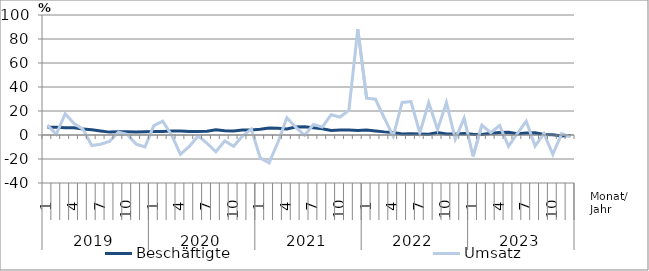
| Category | Beschäftigte | Umsatz |
|---|---|---|
| 0 | 6.4 | 8.2 |
| 1 | 6.5 | 0.6 |
| 2 | 6 | 17.8 |
| 3 | 6.1 | 9.6 |
| 4 | 4.9 | 4.9 |
| 5 | 4.3 | -8.8 |
| 6 | 3.3 | -7.7 |
| 7 | 2.4 | -5.4 |
| 8 | 2.8 | 2.4 |
| 9 | 2.7 | 0.5 |
| 10 | 2.5 | -7.6 |
| 11 | 2.7 | -10 |
| 12 | 2.9 | 7.8 |
| 13 | 2.9 | 11.5 |
| 14 | 3.4 | 0.1 |
| 15 | 3.4 | -16.1 |
| 16 | 2.9 | -9.5 |
| 17 | 2.9 | -0.8 |
| 18 | 3.1 | -6.9 |
| 19 | 4.3 | -14 |
| 20 | 3.6 | -4.9 |
| 21 | 3.4 | -9.4 |
| 22 | 4.1 | -0.9 |
| 23 | 4.1 | 4.9 |
| 24 | 4.8 | -19.1 |
| 25 | 5.8 | -23.3 |
| 26 | 5.6 | -6.1 |
| 27 | 5 | 14.4 |
| 28 | 6.6 | 6.6 |
| 29 | 6.9 | -0.3 |
| 30 | 6 | 8.7 |
| 31 | 5.2 | 6.7 |
| 32 | 3.8 | 16.9 |
| 33 | 4.2 | 15 |
| 34 | 4.2 | 20.6 |
| 35 | 3.7 | 88.1 |
| 36 | 4.1 | 30.7 |
| 37 | 3.4 | 29.8 |
| 38 | 2.6 | 14.1 |
| 39 | 2.1 | -1.1 |
| 40 | 0.9 | 27.1 |
| 41 | 1 | 27.9 |
| 42 | 0.8 | 1.7 |
| 43 | 0.7 | 27 |
| 44 | 2 | 4.7 |
| 45 | 0.9 | 27.1 |
| 46 | 0.9 | -3.5 |
| 47 | 1.2 | 14.1 |
| 48 | 0.6 | -17.8 |
| 49 | 0.5 | 8.2 |
| 50 | 1.4 | 1.9 |
| 51 | 2 | 7.9 |
| 52 | 2.2 | -9.4 |
| 53 | 1 | 1.3 |
| 54 | 1.6 | 11.5 |
| 55 | 1.8 | -9.2 |
| 56 | 0.4 | 1.2 |
| 57 | 0.2 | -16.1 |
| 58 | -0.9 | 1.2 |
| 59 | -0.4 | -1.6 |